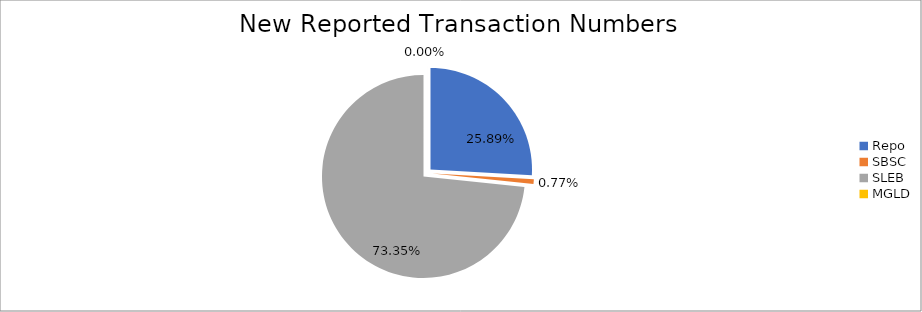
| Category | Series 0 |
|---|---|
| Repo | 171532 |
| SBSC | 5082 |
| SLEB | 486020 |
| MGLD | 7 |